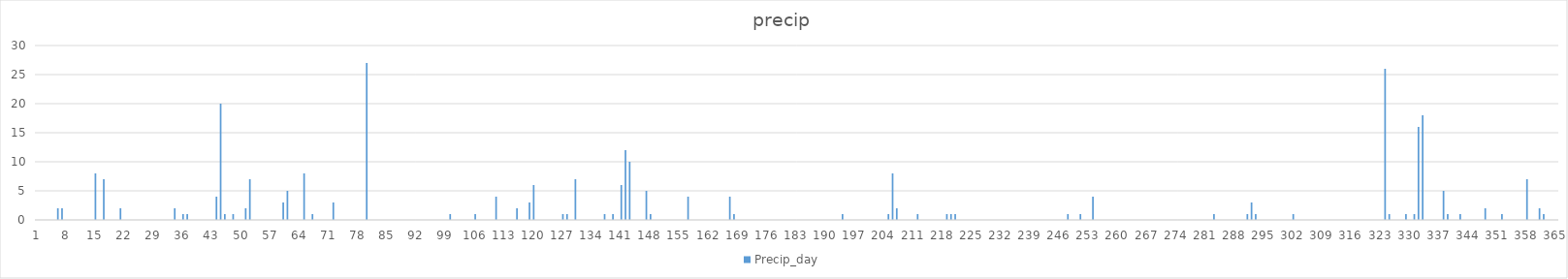
| Category | Precip_day |
|---|---|
| 0 | 0 |
| 1 | 0 |
| 2 | 0 |
| 3 | 0 |
| 4 | 0 |
| 5 | 2 |
| 6 | 2 |
| 7 | 0 |
| 8 | 0 |
| 9 | 0 |
| 10 | 0 |
| 11 | 0 |
| 12 | 0 |
| 13 | 0 |
| 14 | 8 |
| 15 | 0 |
| 16 | 7 |
| 17 | 0 |
| 18 | 0 |
| 19 | 0 |
| 20 | 2 |
| 21 | 0 |
| 22 | 0 |
| 23 | 0 |
| 24 | 0 |
| 25 | 0 |
| 26 | 0 |
| 27 | 0 |
| 28 | 0 |
| 29 | 0 |
| 30 | 0 |
| 31 | 0 |
| 32 | 0 |
| 33 | 2 |
| 34 | 0 |
| 35 | 1 |
| 36 | 1 |
| 37 | 0 |
| 38 | 0 |
| 39 | 0 |
| 40 | 0 |
| 41 | 0 |
| 42 | 0 |
| 43 | 4 |
| 44 | 20 |
| 45 | 1 |
| 46 | 0 |
| 47 | 1 |
| 48 | 0 |
| 49 | 0 |
| 50 | 2 |
| 51 | 7 |
| 52 | 0 |
| 53 | 0 |
| 54 | 0 |
| 55 | 0 |
| 56 | 0 |
| 57 | 0 |
| 58 | 0 |
| 59 | 3 |
| 60 | 5 |
| 61 | 0 |
| 62 | 0 |
| 63 | 0 |
| 64 | 8 |
| 65 | 0 |
| 66 | 1 |
| 67 | 0 |
| 68 | 0 |
| 69 | 0 |
| 70 | 0 |
| 71 | 3 |
| 72 | 0 |
| 73 | 0 |
| 74 | 0 |
| 75 | 0 |
| 76 | 0 |
| 77 | 0 |
| 78 | 0 |
| 79 | 27 |
| 80 | 0 |
| 81 | 0 |
| 82 | 0 |
| 83 | 0 |
| 84 | 0 |
| 85 | 0 |
| 86 | 0 |
| 87 | 0 |
| 88 | 0 |
| 89 | 0 |
| 90 | 0 |
| 91 | 0 |
| 92 | 0 |
| 93 | 0 |
| 94 | 0 |
| 95 | 0 |
| 96 | 0 |
| 97 | 0 |
| 98 | 0 |
| 99 | 1 |
| 100 | 0 |
| 101 | 0 |
| 102 | 0 |
| 103 | 0 |
| 104 | 0 |
| 105 | 1 |
| 106 | 0 |
| 107 | 0 |
| 108 | 0 |
| 109 | 0 |
| 110 | 4 |
| 111 | 0 |
| 112 | 0 |
| 113 | 0 |
| 114 | 0 |
| 115 | 2 |
| 116 | 0 |
| 117 | 0 |
| 118 | 3 |
| 119 | 6 |
| 120 | 0 |
| 121 | 0 |
| 122 | 0 |
| 123 | 0 |
| 124 | 0 |
| 125 | 0 |
| 126 | 1 |
| 127 | 1 |
| 128 | 0 |
| 129 | 7 |
| 130 | 0 |
| 131 | 0 |
| 132 | 0 |
| 133 | 0 |
| 134 | 0 |
| 135 | 0 |
| 136 | 1 |
| 137 | 0 |
| 138 | 1 |
| 139 | 0 |
| 140 | 6 |
| 141 | 12 |
| 142 | 10 |
| 143 | 0 |
| 144 | 0 |
| 145 | 0 |
| 146 | 5 |
| 147 | 1 |
| 148 | 0 |
| 149 | 0 |
| 150 | 0 |
| 151 | 0 |
| 152 | 0 |
| 153 | 0 |
| 154 | 0 |
| 155 | 0 |
| 156 | 4 |
| 157 | 0 |
| 158 | 0 |
| 159 | 0 |
| 160 | 0 |
| 161 | 0 |
| 162 | 0 |
| 163 | 0 |
| 164 | 0 |
| 165 | 0 |
| 166 | 4 |
| 167 | 1 |
| 168 | 0 |
| 169 | 0 |
| 170 | 0 |
| 171 | 0 |
| 172 | 0 |
| 173 | 0 |
| 174 | 0 |
| 175 | 0 |
| 176 | 0 |
| 177 | 0 |
| 178 | 0 |
| 179 | 0 |
| 180 | 0 |
| 181 | 0 |
| 182 | 0 |
| 183 | 0 |
| 184 | 0 |
| 185 | 0 |
| 186 | 0 |
| 187 | 0 |
| 188 | 0 |
| 189 | 0 |
| 190 | 0 |
| 191 | 0 |
| 192 | 0 |
| 193 | 1 |
| 194 | 0 |
| 195 | 0 |
| 196 | 0 |
| 197 | 0 |
| 198 | 0 |
| 199 | 0 |
| 200 | 0 |
| 201 | 0 |
| 202 | 0 |
| 203 | 0 |
| 204 | 1 |
| 205 | 8 |
| 206 | 2 |
| 207 | 0 |
| 208 | 0 |
| 209 | 0 |
| 210 | 0 |
| 211 | 1 |
| 212 | 0 |
| 213 | 0 |
| 214 | 0 |
| 215 | 0 |
| 216 | 0 |
| 217 | 0 |
| 218 | 1 |
| 219 | 1 |
| 220 | 1 |
| 221 | 0 |
| 222 | 0 |
| 223 | 0 |
| 224 | 0 |
| 225 | 0 |
| 226 | 0 |
| 227 | 0 |
| 228 | 0 |
| 229 | 0 |
| 230 | 0 |
| 231 | 0 |
| 232 | 0 |
| 233 | 0 |
| 234 | 0 |
| 235 | 0 |
| 236 | 0 |
| 237 | 0 |
| 238 | 0 |
| 239 | 0 |
| 240 | 0 |
| 241 | 0 |
| 242 | 0 |
| 243 | 0 |
| 244 | 0 |
| 245 | 0 |
| 246 | 0 |
| 247 | 1 |
| 248 | 0 |
| 249 | 0 |
| 250 | 1 |
| 251 | 0 |
| 252 | 0 |
| 253 | 4 |
| 254 | 0 |
| 255 | 0 |
| 256 | 0 |
| 257 | 0 |
| 258 | 0 |
| 259 | 0 |
| 260 | 0 |
| 261 | 0 |
| 262 | 0 |
| 263 | 0 |
| 264 | 0 |
| 265 | 0 |
| 266 | 0 |
| 267 | 0 |
| 268 | 0 |
| 269 | 0 |
| 270 | 0 |
| 271 | 0 |
| 272 | 0 |
| 273 | 0 |
| 274 | 0 |
| 275 | 0 |
| 276 | 0 |
| 277 | 0 |
| 278 | 0 |
| 279 | 0 |
| 280 | 0 |
| 281 | 0 |
| 282 | 1 |
| 283 | 0 |
| 284 | 0 |
| 285 | 0 |
| 286 | 0 |
| 287 | 0 |
| 288 | 0 |
| 289 | 0 |
| 290 | 1 |
| 291 | 3 |
| 292 | 1 |
| 293 | 0 |
| 294 | 0 |
| 295 | 0 |
| 296 | 0 |
| 297 | 0 |
| 298 | 0 |
| 299 | 0 |
| 300 | 0 |
| 301 | 1 |
| 302 | 0 |
| 303 | 0 |
| 304 | 0 |
| 305 | 0 |
| 306 | 0 |
| 307 | 0 |
| 308 | 0 |
| 309 | 0 |
| 310 | 0 |
| 311 | 0 |
| 312 | 0 |
| 313 | 0 |
| 314 | 0 |
| 315 | 0 |
| 316 | 0 |
| 317 | 0 |
| 318 | 0 |
| 319 | 0 |
| 320 | 0 |
| 321 | 0 |
| 322 | 0 |
| 323 | 26 |
| 324 | 1 |
| 325 | 0 |
| 326 | 0 |
| 327 | 0 |
| 328 | 1 |
| 329 | 0 |
| 330 | 1 |
| 331 | 16 |
| 332 | 18 |
| 333 | 0 |
| 334 | 0 |
| 335 | 0 |
| 336 | 0 |
| 337 | 5 |
| 338 | 1 |
| 339 | 0 |
| 340 | 0 |
| 341 | 1 |
| 342 | 0 |
| 343 | 0 |
| 344 | 0 |
| 345 | 0 |
| 346 | 0 |
| 347 | 2 |
| 348 | 0 |
| 349 | 0 |
| 350 | 0 |
| 351 | 1 |
| 352 | 0 |
| 353 | 0 |
| 354 | 0 |
| 355 | 0 |
| 356 | 0 |
| 357 | 7 |
| 358 | 0 |
| 359 | 0 |
| 360 | 2 |
| 361 | 1 |
| 362 | 0 |
| 363 | 0 |
| 364 | 0 |